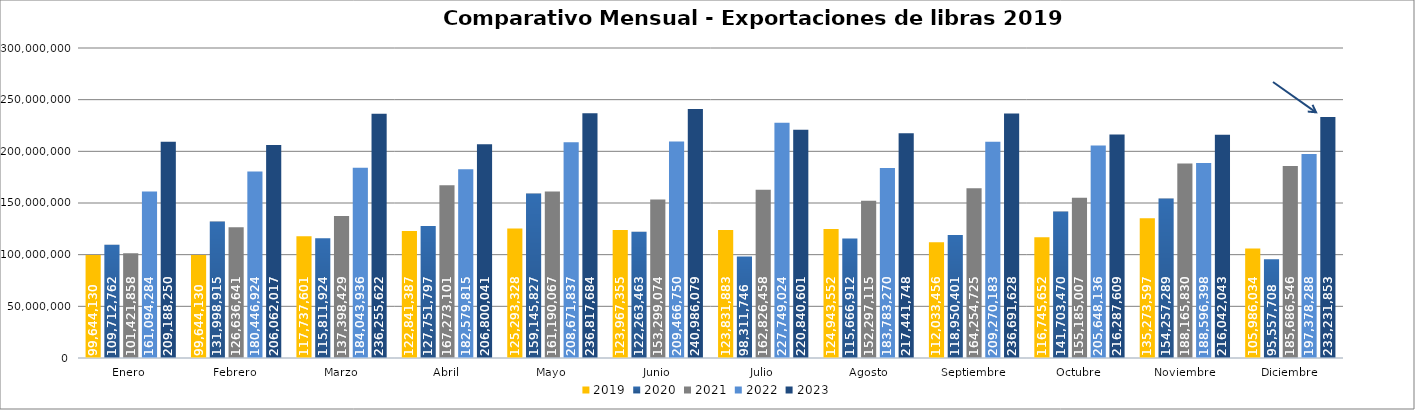
| Category | 2019 | 2020 | 2021 | 2022 | 2023 |
|---|---|---|---|---|---|
| Enero  | 99644130 | 109712762 | 101421858 | 161094284 | 209188250 |
| Febrero | 99644130 | 131998915 | 126636641 | 180446924 | 206062017 |
| Marzo | 117737601 | 115811924 | 137398429 | 184043936 | 236255622 |
| Abril | 122841387 | 127751797 | 167273101 | 182579815 | 206800041 |
| Mayo | 125293328 | 159145827 | 161190067 | 208671837 | 236817684 |
| Junio | 123967355 | 122263463 | 153299074 | 209466750 | 240986079 |
| Julio | 123831883 | 98311746 | 162826458 | 227749024 | 220840601 |
| Agosto | 124943552 | 115666912 | 152297115 | 183783270 | 217441748 |
| Septiembre | 112033456 | 118950401 | 164254725 | 209270183 | 236691628 |
| Octubre | 116745652 | 141703470 | 155185007 | 205648136 | 216287609 |
| Noviembre | 135273597 | 154257289 | 188165830 | 188596398 | 216042043 |
| Diciembre | 105986034 | 95557708 | 185686546 | 197378288 | 233231853 |